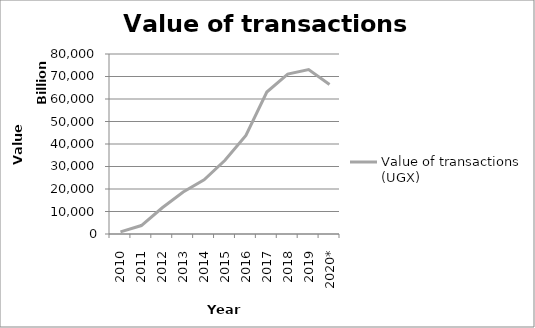
| Category | Value of transactions (UGX) |
|---|---|
| 2010 | 962729509099 |
| 2011 | 3752955104466 |
| 2012 | 11662775517340 |
| 2013 | 18645660340200 |
| 2014 | 24053901819290 |
| 2015 | 32738946480277 |
| 2016 | 43830532622372 |
| 2017 | 63092991145753 |
| 2018 | 71100055945110 |
| 2019 | 73091852190363.02 |
|  2020* | 66447551921594.38 |